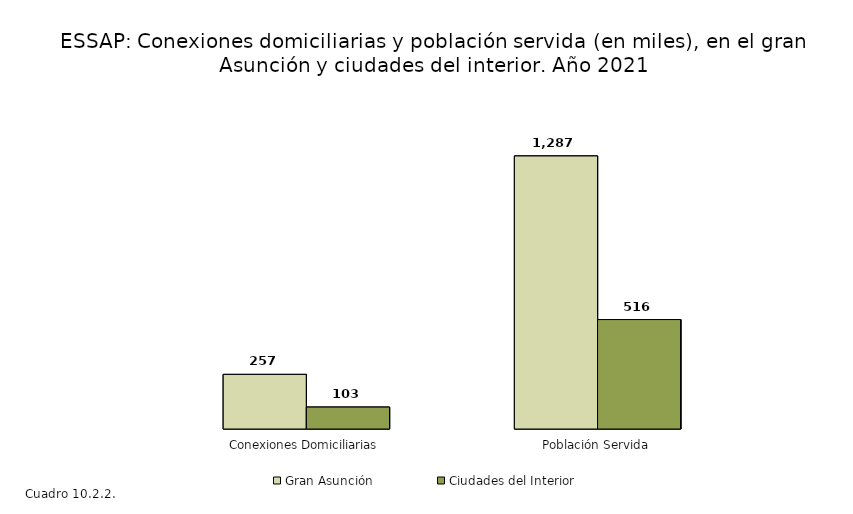
| Category | Gran Asunción | Ciudades del Interior |
|---|---|---|
| Conexiones Domiciliarias | 257.39 | 103.173 |
| Población Servida | 1286.95 | 515.865 |